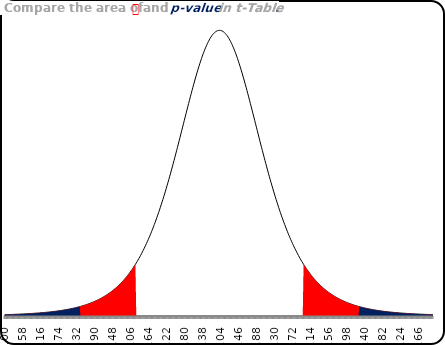
| Category | Series 0 | Series 1 | Series 2 | Series 3 | Series 4 |
|---|---|---|---|---|---|
| -5.0 | 0.002 | 0.002 | 0 | 0 | 0.002 |
| -4.98 | 0.002 | 0.002 | 0 | 0 | 0.002 |
| -4.960000000000001 | 0.002 | 0.002 | 0 | 0 | 0.002 |
| -4.940000000000001 | 0.002 | 0.002 | 0 | 0 | 0.002 |
| -4.920000000000002 | 0.002 | 0.002 | 0 | 0 | 0.002 |
| -4.900000000000002 | 0.002 | 0.002 | 0 | 0 | 0.002 |
| -4.880000000000003 | 0.002 | 0.002 | 0 | 0 | 0.002 |
| -4.860000000000003 | 0.002 | 0.002 | 0 | 0 | 0.002 |
| -4.840000000000003 | 0.002 | 0.002 | 0 | 0 | 0.002 |
| -4.820000000000004 | 0.002 | 0.002 | 0 | 0 | 0.002 |
| -4.800000000000004 | 0.002 | 0.002 | 0 | 0 | 0.002 |
| -4.780000000000005 | 0.002 | 0.002 | 0 | 0 | 0.002 |
| -4.760000000000005 | 0.002 | 0.002 | 0 | 0 | 0.002 |
| -4.7400000000000055 | 0.002 | 0.002 | 0 | 0 | 0.002 |
| -4.720000000000006 | 0.002 | 0.002 | 0 | 0 | 0.002 |
| -4.700000000000006 | 0.002 | 0.002 | 0 | 0 | 0.002 |
| -4.680000000000007 | 0.002 | 0.002 | 0 | 0 | 0.002 |
| -4.660000000000007 | 0.002 | 0.002 | 0 | 0 | 0.002 |
| -4.640000000000008 | 0.003 | 0.003 | 0 | 0 | 0.003 |
| -4.620000000000008 | 0.003 | 0.003 | 0 | 0 | 0.003 |
| -4.6000000000000085 | 0.003 | 0.003 | 0 | 0 | 0.003 |
| -4.580000000000009 | 0.003 | 0.003 | 0 | 0 | 0.003 |
| -4.560000000000009 | 0.003 | 0.003 | 0 | 0 | 0.003 |
| -4.54000000000001 | 0.003 | 0.003 | 0 | 0 | 0.003 |
| -4.52000000000001 | 0.003 | 0.003 | 0 | 0 | 0.003 |
| -4.500000000000011 | 0.003 | 0.003 | 0 | 0 | 0.003 |
| -4.480000000000011 | 0.003 | 0.003 | 0 | 0 | 0.003 |
| -4.4600000000000115 | 0.003 | 0.003 | 0 | 0 | 0.003 |
| -4.440000000000012 | 0.003 | 0.003 | 0 | 0 | 0.003 |
| -4.420000000000012 | 0.003 | 0.003 | 0 | 0 | 0.003 |
| -4.400000000000013 | 0.003 | 0.003 | 0 | 0 | 0.003 |
| -4.380000000000013 | 0.003 | 0.003 | 0 | 0 | 0.003 |
| -4.360000000000014 | 0.003 | 0.003 | 0 | 0 | 0.003 |
| -4.340000000000014 | 0.004 | 0.004 | 0 | 0 | 0.004 |
| -4.3200000000000145 | 0.004 | 0.004 | 0 | 0 | 0.004 |
| -4.300000000000015 | 0.004 | 0.004 | 0 | 0 | 0.004 |
| -4.280000000000015 | 0.004 | 0.004 | 0 | 0 | 0.004 |
| -4.260000000000016 | 0.004 | 0.004 | 0 | 0 | 0.004 |
| -4.240000000000016 | 0.004 | 0.004 | 0 | 0 | 0.004 |
| -4.220000000000017 | 0.004 | 0.004 | 0 | 0 | 0.004 |
| -4.200000000000017 | 0.004 | 0.004 | 0 | 0 | 0.004 |
| -4.1800000000000175 | 0.004 | 0.004 | 0 | 0 | 0.004 |
| -4.160000000000018 | 0.004 | 0.004 | 0 | 0 | 0.004 |
| -4.140000000000018 | 0.004 | 0.004 | 0 | 0 | 0.004 |
| -4.120000000000019 | 0.004 | 0.004 | 0 | 0 | 0.004 |
| -4.100000000000019 | 0.005 | 0.005 | 0 | 0 | 0.005 |
| -4.08000000000002 | 0.005 | 0.005 | 0 | 0 | 0.005 |
| -4.06000000000002 | 0.005 | 0.005 | 0 | 0 | 0.005 |
| -4.0400000000000205 | 0.005 | 0.005 | 0 | 0 | 0.005 |
| -4.020000000000021 | 0.005 | 0.005 | 0 | 0 | 0.005 |
| -4.000000000000021 | 0.005 | 0.005 | 0 | 0 | 0.005 |
| -3.9800000000000213 | 0.005 | 0.005 | 0 | 0 | 0.005 |
| -3.9600000000000213 | 0.005 | 0.005 | 0 | 0 | 0.005 |
| -3.9400000000000213 | 0.005 | 0.005 | 0 | 0 | 0.005 |
| -3.9200000000000212 | 0.006 | 0.006 | 0 | 0 | 0.006 |
| -3.9000000000000212 | 0.006 | 0.006 | 0 | 0 | 0.006 |
| -3.880000000000021 | 0.006 | 0.006 | 0 | 0 | 0.006 |
| -3.860000000000021 | 0.006 | 0.006 | 0 | 0 | 0.006 |
| -3.840000000000021 | 0.006 | 0.006 | 0 | 0 | 0.006 |
| -3.820000000000021 | 0.006 | 0.006 | 0 | 0 | 0.006 |
| -3.800000000000021 | 0.006 | 0.006 | 0 | 0 | 0.006 |
| -3.780000000000021 | 0.007 | 0.007 | 0 | 0 | 0.007 |
| -3.760000000000021 | 0.007 | 0.007 | 0 | 0 | 0.007 |
| -3.740000000000021 | 0.007 | 0.007 | 0 | 0 | 0.007 |
| -3.720000000000021 | 0.007 | 0.007 | 0 | 0 | 0.007 |
| -3.700000000000021 | 0.007 | 0.007 | 0 | 0 | 0.007 |
| -3.680000000000021 | 0.007 | 0.007 | 0 | 0 | 0.007 |
| -3.660000000000021 | 0.008 | 0.008 | 0 | 0 | 0.008 |
| -3.640000000000021 | 0.008 | 0.008 | 0 | 0 | 0.008 |
| -3.620000000000021 | 0.008 | 0.008 | 0 | 0 | 0.008 |
| -3.600000000000021 | 0.008 | 0.008 | 0 | 0 | 0.008 |
| -3.580000000000021 | 0.008 | 0.008 | 0 | 0 | 0.008 |
| -3.560000000000021 | 0.009 | 0.009 | 0 | 0 | 0.009 |
| -3.540000000000021 | 0.009 | 0.009 | 0 | 0 | 0.009 |
| -3.520000000000021 | 0.009 | 0.009 | 0 | 0 | 0.009 |
| -3.500000000000021 | 0.009 | 0.009 | 0 | 0 | 0.009 |
| -3.480000000000021 | 0.009 | 0.009 | 0 | 0 | 0.009 |
| -3.460000000000021 | 0.01 | 0.01 | 0 | 0 | 0.01 |
| -3.440000000000021 | 0.01 | 0.01 | 0 | 0 | 0.01 |
| -3.420000000000021 | 0.01 | 0.01 | 0 | 0 | 0.01 |
| -3.400000000000021 | 0.01 | 0.01 | 0 | 0 | 0.01 |
| -3.3800000000000208 | 0.011 | 0.011 | 0 | 0 | 0.011 |
| -3.3600000000000207 | 0.011 | 0.011 | 0 | 0 | 0.011 |
| -3.3400000000000207 | 0.011 | 0.011 | 0 | 0 | 0.011 |
| -3.3200000000000207 | 0.012 | 0.012 | 0 | 0 | 0.012 |
| -3.3000000000000207 | 0.012 | 0.012 | 0 | 0 | 0.012 |
| -3.2800000000000207 | 0.012 | 0.012 | 0 | 0 | 0.012 |
| -3.2600000000000207 | 0.012 | 0.012 | 0 | 0 | 0.012 |
| -3.2400000000000206 | 0.013 | 0.013 | 0 | 0 | 0 |
| -3.2200000000000206 | 0.013 | 0.013 | 0 | 0 | 0 |
| -3.2000000000000206 | 0.013 | 0.013 | 0 | 0 | 0 |
| -3.1800000000000206 | 0.014 | 0.014 | 0 | 0 | 0 |
| -3.1600000000000206 | 0.014 | 0.014 | 0 | 0 | 0 |
| -3.1400000000000206 | 0.014 | 0.014 | 0 | 0 | 0 |
| -3.1200000000000205 | 0.015 | 0.015 | 0 | 0 | 0 |
| -3.1000000000000205 | 0.015 | 0.015 | 0 | 0 | 0 |
| -3.0800000000000205 | 0.016 | 0.016 | 0 | 0 | 0 |
| -3.0600000000000205 | 0.016 | 0.016 | 0 | 0 | 0 |
| -3.0400000000000205 | 0.016 | 0.016 | 0 | 0 | 0 |
| -3.0200000000000204 | 0.017 | 0.017 | 0 | 0 | 0 |
| -3.0000000000000204 | 0.017 | 0.017 | 0 | 0 | 0 |
| -2.9800000000000204 | 0.018 | 0.018 | 0 | 0 | 0 |
| -2.9600000000000204 | 0.018 | 0.018 | 0 | 0 | 0 |
| -2.9400000000000204 | 0.019 | 0.019 | 0 | 0 | 0 |
| -2.9200000000000204 | 0.019 | 0.019 | 0 | 0 | 0 |
| -2.9000000000000203 | 0.02 | 0.02 | 0 | 0 | 0 |
| -2.8800000000000203 | 0.02 | 0.02 | 0 | 0 | 0 |
| -2.8600000000000203 | 0.021 | 0.021 | 0 | 0 | 0 |
| -2.8400000000000203 | 0.021 | 0.021 | 0 | 0 | 0 |
| -2.8200000000000203 | 0.022 | 0.022 | 0 | 0 | 0 |
| -2.8000000000000203 | 0.022 | 0.022 | 0 | 0 | 0 |
| -2.7800000000000202 | 0.023 | 0.023 | 0 | 0 | 0 |
| -2.76000000000002 | 0.024 | 0.024 | 0 | 0 | 0 |
| -2.74000000000002 | 0.024 | 0.024 | 0 | 0 | 0 |
| -2.72000000000002 | 0.025 | 0.025 | 0 | 0 | 0 |
| -2.70000000000002 | 0.026 | 0.026 | 0 | 0 | 0 |
| -2.68000000000002 | 0.026 | 0.026 | 0 | 0 | 0 |
| -2.66000000000002 | 0.027 | 0.027 | 0 | 0 | 0 |
| -2.64000000000002 | 0.028 | 0.028 | 0 | 0 | 0 |
| -2.62000000000002 | 0.028 | 0.028 | 0 | 0 | 0 |
| -2.60000000000002 | 0.029 | 0.029 | 0 | 0 | 0 |
| -2.58000000000002 | 0.03 | 0.03 | 0 | 0 | 0 |
| -2.56000000000002 | 0.031 | 0.031 | 0 | 0 | 0 |
| -2.54000000000002 | 0.032 | 0.032 | 0 | 0 | 0 |
| -2.52000000000002 | 0.032 | 0.032 | 0 | 0 | 0 |
| -2.50000000000002 | 0.033 | 0.033 | 0 | 0 | 0 |
| -2.48000000000002 | 0.034 | 0.034 | 0 | 0 | 0 |
| -2.46000000000002 | 0.035 | 0.035 | 0 | 0 | 0 |
| -2.44000000000002 | 0.036 | 0.036 | 0 | 0 | 0 |
| -2.42000000000002 | 0.037 | 0.037 | 0 | 0 | 0 |
| -2.40000000000002 | 0.038 | 0.038 | 0 | 0 | 0 |
| -2.38000000000002 | 0.039 | 0.039 | 0 | 0 | 0 |
| -2.36000000000002 | 0.04 | 0.04 | 0 | 0 | 0 |
| -2.34000000000002 | 0.041 | 0.041 | 0 | 0 | 0 |
| -2.32000000000002 | 0.042 | 0.042 | 0 | 0 | 0 |
| -2.30000000000002 | 0.044 | 0.044 | 0 | 0 | 0 |
| -2.28000000000002 | 0.045 | 0.045 | 0 | 0 | 0 |
| -2.2600000000000198 | 0.046 | 0.046 | 0 | 0 | 0 |
| -2.2400000000000198 | 0.047 | 0.047 | 0 | 0 | 0 |
| -2.2200000000000197 | 0.048 | 0.048 | 0 | 0 | 0 |
| -2.2000000000000197 | 0.05 | 0.05 | 0 | 0 | 0 |
| -2.1800000000000197 | 0.051 | 0.051 | 0 | 0 | 0 |
| -2.1600000000000197 | 0.053 | 0.053 | 0 | 0 | 0 |
| -2.1400000000000197 | 0.054 | 0.054 | 0 | 0 | 0 |
| -2.1200000000000196 | 0.055 | 0.055 | 0 | 0 | 0 |
| -2.1000000000000196 | 0.057 | 0.057 | 0 | 0 | 0 |
| -2.0800000000000196 | 0.058 | 0.058 | 0 | 0 | 0 |
| -2.0600000000000196 | 0.06 | 0.06 | 0 | 0 | 0 |
| -2.0400000000000196 | 0.062 | 0.062 | 0 | 0 | 0 |
| -2.0200000000000196 | 0.063 | 0.063 | 0 | 0 | 0 |
| -2.0000000000000195 | 0.065 | 0.065 | 0 | 0 | 0 |
| -1.9800000000000195 | 0.067 | 0.067 | 0 | 0 | 0 |
| -1.9600000000000195 | 0.069 | 0.069 | 0 | 0 | 0 |
| -1.9400000000000195 | 0.071 | 0 | 0 | 0 | 0 |
| -1.9200000000000195 | 0.072 | 0 | 0 | 0 | 0 |
| -1.9000000000000195 | 0.074 | 0 | 0 | 0 | 0 |
| -1.8800000000000194 | 0.076 | 0 | 0 | 0 | 0 |
| -1.8600000000000194 | 0.078 | 0 | 0 | 0 | 0 |
| -1.8400000000000194 | 0.08 | 0 | 0 | 0 | 0 |
| -1.8200000000000194 | 0.083 | 0 | 0 | 0 | 0 |
| -1.8000000000000194 | 0.085 | 0 | 0 | 0 | 0 |
| -1.7800000000000193 | 0.087 | 0 | 0 | 0 | 0 |
| -1.7600000000000193 | 0.089 | 0 | 0 | 0 | 0 |
| -1.7400000000000193 | 0.092 | 0 | 0 | 0 | 0 |
| -1.7200000000000193 | 0.094 | 0 | 0 | 0 | 0 |
| -1.7000000000000193 | 0.097 | 0 | 0 | 0 | 0 |
| -1.6800000000000193 | 0.099 | 0 | 0 | 0 | 0 |
| -1.6600000000000192 | 0.102 | 0 | 0 | 0 | 0 |
| -1.6400000000000192 | 0.104 | 0 | 0 | 0 | 0 |
| -1.6200000000000192 | 0.107 | 0 | 0 | 0 | 0 |
| -1.6000000000000192 | 0.11 | 0 | 0 | 0 | 0 |
| -1.5800000000000192 | 0.113 | 0 | 0 | 0 | 0 |
| -1.5600000000000191 | 0.116 | 0 | 0 | 0 | 0 |
| -1.5400000000000191 | 0.118 | 0 | 0 | 0 | 0 |
| -1.5200000000000191 | 0.121 | 0 | 0 | 0 | 0 |
| -1.500000000000019 | 0.125 | 0 | 0 | 0 | 0 |
| -1.480000000000019 | 0.128 | 0 | 0 | 0 | 0 |
| -1.460000000000019 | 0.131 | 0 | 0 | 0 | 0 |
| -1.440000000000019 | 0.134 | 0 | 0 | 0 | 0 |
| -1.420000000000019 | 0.137 | 0 | 0 | 0 | 0 |
| -1.400000000000019 | 0.141 | 0 | 0 | 0 | 0 |
| -1.380000000000019 | 0.144 | 0 | 0 | 0 | 0 |
| -1.360000000000019 | 0.148 | 0 | 0 | 0 | 0 |
| -1.340000000000019 | 0.151 | 0 | 0 | 0 | 0 |
| -1.320000000000019 | 0.155 | 0 | 0 | 0 | 0 |
| -1.300000000000019 | 0.158 | 0 | 0 | 0 | 0 |
| -1.280000000000019 | 0.162 | 0 | 0 | 0 | 0 |
| -1.2600000000000189 | 0.166 | 0 | 0 | 0 | 0 |
| -1.2400000000000189 | 0.17 | 0 | 0 | 0 | 0 |
| -1.2200000000000188 | 0.174 | 0 | 0 | 0 | 0 |
| -1.2000000000000188 | 0.178 | 0 | 0 | 0 | 0 |
| -1.1800000000000188 | 0.182 | 0 | 0 | 0 | 0 |
| -1.1600000000000188 | 0.186 | 0 | 0 | 0 | 0 |
| -1.1400000000000188 | 0.19 | 0 | 0 | 0 | 0 |
| -1.1200000000000188 | 0.194 | 0 | 0 | 0 | 0 |
| -1.1000000000000187 | 0.198 | 0 | 0 | 0 | 0 |
| -1.0800000000000187 | 0.202 | 0 | 0 | 0 | 0 |
| -1.0600000000000187 | 0.207 | 0 | 0 | 0 | 0 |
| -1.0400000000000187 | 0.211 | 0 | 0 | 0 | 0 |
| -1.0200000000000187 | 0.215 | 0 | 0 | 0 | 0 |
| -1.0000000000000187 | 0.22 | 0 | 0 | 0 | 0 |
| -0.9800000000000186 | 0.224 | 0 | 0 | 0 | 0 |
| -0.9600000000000186 | 0.229 | 0 | 0 | 0 | 0 |
| -0.9400000000000186 | 0.233 | 0 | 0 | 0 | 0 |
| -0.9200000000000186 | 0.237 | 0 | 0 | 0 | 0 |
| -0.9000000000000186 | 0.242 | 0 | 0 | 0 | 0 |
| -0.8800000000000185 | 0.246 | 0 | 0 | 0 | 0 |
| -0.8600000000000185 | 0.251 | 0 | 0 | 0 | 0 |
| -0.8400000000000185 | 0.255 | 0 | 0 | 0 | 0 |
| -0.8200000000000185 | 0.26 | 0 | 0 | 0 | 0 |
| -0.8000000000000185 | 0.264 | 0 | 0 | 0 | 0 |
| -0.7800000000000185 | 0.269 | 0 | 0 | 0 | 0 |
| -0.7600000000000184 | 0.273 | 0 | 0 | 0 | 0 |
| -0.7400000000000184 | 0.278 | 0 | 0 | 0 | 0 |
| -0.7200000000000184 | 0.282 | 0 | 0 | 0 | 0 |
| -0.7000000000000184 | 0.287 | 0 | 0 | 0 | 0 |
| -0.6800000000000184 | 0.291 | 0 | 0 | 0 | 0 |
| -0.6600000000000183 | 0.295 | 0 | 0 | 0 | 0 |
| -0.6400000000000183 | 0.3 | 0 | 0 | 0 | 0 |
| -0.6200000000000183 | 0.304 | 0 | 0 | 0 | 0 |
| -0.6000000000000183 | 0.308 | 0 | 0 | 0 | 0 |
| -0.5800000000000183 | 0.312 | 0 | 0 | 0 | 0 |
| -0.5600000000000183 | 0.316 | 0 | 0 | 0 | 0 |
| -0.5400000000000182 | 0.32 | 0 | 0 | 0 | 0 |
| -0.5200000000000182 | 0.324 | 0 | 0 | 0 | 0 |
| -0.5000000000000182 | 0.328 | 0 | 0 | 0 | 0 |
| -0.4800000000000182 | 0.332 | 0 | 0 | 0 | 0 |
| -0.46000000000001817 | 0.335 | 0 | 0 | 0 | 0 |
| -0.44000000000001815 | 0.339 | 0 | 0 | 0 | 0 |
| -0.42000000000001814 | 0.342 | 0 | 0 | 0 | 0 |
| -0.4000000000000181 | 0.345 | 0 | 0 | 0 | 0 |
| -0.3800000000000181 | 0.349 | 0 | 0 | 0 | 0 |
| -0.3600000000000181 | 0.352 | 0 | 0 | 0 | 0 |
| -0.34000000000001807 | 0.354 | 0 | 0 | 0 | 0 |
| -0.32000000000001805 | 0.357 | 0 | 0 | 0 | 0 |
| -0.30000000000001803 | 0.36 | 0 | 0 | 0 | 0 |
| -0.280000000000018 | 0.362 | 0 | 0 | 0 | 0 |
| -0.260000000000018 | 0.365 | 0 | 0 | 0 | 0 |
| -0.240000000000018 | 0.367 | 0 | 0 | 0 | 0 |
| -0.22000000000001801 | 0.369 | 0 | 0 | 0 | 0 |
| -0.20000000000001802 | 0.371 | 0 | 0 | 0 | 0 |
| -0.18000000000001803 | 0.372 | 0 | 0 | 0 | 0 |
| -0.16000000000001804 | 0.374 | 0 | 0 | 0 | 0 |
| -0.14000000000001805 | 0.375 | 0 | 0 | 0 | 0 |
| -0.12000000000001805 | 0.376 | 0 | 0 | 0 | 0 |
| -0.10000000000001805 | 0.377 | 0 | 0 | 0 | 0 |
| -0.08000000000001804 | 0.378 | 0 | 0 | 0 | 0 |
| -0.06000000000001804 | 0.379 | 0 | 0 | 0 | 0 |
| -0.040000000000018035 | 0.379 | 0 | 0 | 0 | 0 |
| -0.020000000000018035 | 0.38 | 0 | 0 | 0 | 0 |
| -1.8034185256254887e-14 | 0.38 | 0 | 0 | 0 | 0 |
| 0.019999999999981966 | 0.38 | 0 | 0 | 0 | 0 |
| 0.03999999999998197 | 0.379 | 0 | 0 | 0 | 0 |
| 0.05999999999998197 | 0.379 | 0 | 0 | 0 | 0 |
| 0.07999999999998197 | 0.378 | 0 | 0 | 0 | 0 |
| 0.09999999999998198 | 0.377 | 0 | 0 | 0 | 0 |
| 0.11999999999998198 | 0.376 | 0 | 0 | 0 | 0 |
| 0.13999999999998197 | 0.375 | 0 | 0 | 0 | 0 |
| 0.15999999999998196 | 0.374 | 0 | 0 | 0 | 0 |
| 0.17999999999998195 | 0.372 | 0 | 0 | 0 | 0 |
| 0.19999999999998194 | 0.371 | 0 | 0 | 0 | 0 |
| 0.21999999999998193 | 0.369 | 0 | 0 | 0 | 0 |
| 0.23999999999998192 | 0.367 | 0 | 0 | 0 | 0 |
| 0.2599999999999819 | 0.365 | 0 | 0 | 0 | 0 |
| 0.27999999999998193 | 0.362 | 0 | 0 | 0 | 0 |
| 0.29999999999998195 | 0.36 | 0 | 0 | 0 | 0 |
| 0.31999999999998197 | 0.357 | 0 | 0 | 0 | 0 |
| 0.339999999999982 | 0.354 | 0 | 0 | 0 | 0 |
| 0.359999999999982 | 0.352 | 0 | 0 | 0 | 0 |
| 0.379999999999982 | 0.349 | 0 | 0 | 0 | 0 |
| 0.39999999999998204 | 0.345 | 0 | 0 | 0 | 0 |
| 0.41999999999998205 | 0.342 | 0 | 0 | 0 | 0 |
| 0.43999999999998207 | 0.339 | 0 | 0 | 0 | 0 |
| 0.4599999999999821 | 0.335 | 0 | 0 | 0 | 0 |
| 0.4799999999999821 | 0.332 | 0 | 0 | 0 | 0 |
| 0.4999999999999821 | 0.328 | 0 | 0 | 0 | 0 |
| 0.5199999999999821 | 0.324 | 0 | 0 | 0 | 0 |
| 0.5399999999999822 | 0.32 | 0 | 0 | 0 | 0 |
| 0.5599999999999822 | 0.316 | 0 | 0 | 0 | 0 |
| 0.5799999999999822 | 0.312 | 0 | 0 | 0 | 0 |
| 0.5999999999999822 | 0.308 | 0 | 0 | 0 | 0 |
| 0.6199999999999822 | 0.304 | 0 | 0 | 0 | 0 |
| 0.6399999999999822 | 0.3 | 0 | 0 | 0 | 0 |
| 0.6599999999999823 | 0.295 | 0 | 0 | 0 | 0 |
| 0.6799999999999823 | 0.291 | 0 | 0 | 0 | 0 |
| 0.6999999999999823 | 0.287 | 0 | 0 | 0 | 0 |
| 0.7199999999999823 | 0.282 | 0 | 0 | 0 | 0 |
| 0.7399999999999823 | 0.278 | 0 | 0 | 0 | 0 |
| 0.7599999999999824 | 0.273 | 0 | 0 | 0 | 0 |
| 0.7799999999999824 | 0.269 | 0 | 0 | 0 | 0 |
| 0.7999999999999824 | 0.264 | 0 | 0 | 0 | 0 |
| 0.8199999999999824 | 0.26 | 0 | 0 | 0 | 0 |
| 0.8399999999999824 | 0.255 | 0 | 0 | 0 | 0 |
| 0.8599999999999824 | 0.251 | 0 | 0 | 0 | 0 |
| 0.8799999999999825 | 0.246 | 0 | 0 | 0 | 0 |
| 0.8999999999999825 | 0.242 | 0 | 0 | 0 | 0 |
| 0.9199999999999825 | 0.237 | 0 | 0 | 0 | 0 |
| 0.9399999999999825 | 0.233 | 0 | 0 | 0 | 0 |
| 0.9599999999999825 | 0.229 | 0 | 0 | 0 | 0 |
| 0.9799999999999826 | 0.224 | 0 | 0 | 0 | 0 |
| 0.9999999999999826 | 0.22 | 0 | 0 | 0 | 0 |
| 1.0199999999999825 | 0.215 | 0 | 0 | 0 | 0 |
| 1.0399999999999825 | 0.211 | 0 | 0 | 0 | 0 |
| 1.0599999999999825 | 0.207 | 0 | 0 | 0 | 0 |
| 1.0799999999999825 | 0.202 | 0 | 0 | 0 | 0 |
| 1.0999999999999825 | 0.198 | 0 | 0 | 0 | 0 |
| 1.1199999999999826 | 0.194 | 0 | 0 | 0 | 0 |
| 1.1399999999999826 | 0.19 | 0 | 0 | 0 | 0 |
| 1.1599999999999826 | 0.186 | 0 | 0 | 0 | 0 |
| 1.1799999999999826 | 0.182 | 0 | 0 | 0 | 0 |
| 1.1999999999999826 | 0.178 | 0 | 0 | 0 | 0 |
| 1.2199999999999827 | 0.174 | 0 | 0 | 0 | 0 |
| 1.2399999999999827 | 0.17 | 0 | 0 | 0 | 0 |
| 1.2599999999999827 | 0.166 | 0 | 0 | 0 | 0 |
| 1.2799999999999827 | 0.162 | 0 | 0 | 0 | 0 |
| 1.2999999999999827 | 0.158 | 0 | 0 | 0 | 0 |
| 1.3199999999999827 | 0.155 | 0 | 0 | 0 | 0 |
| 1.3399999999999828 | 0.151 | 0 | 0 | 0 | 0 |
| 1.3599999999999828 | 0.148 | 0 | 0 | 0 | 0 |
| 1.3799999999999828 | 0.144 | 0 | 0 | 0 | 0 |
| 1.3999999999999828 | 0.141 | 0 | 0 | 0 | 0 |
| 1.4199999999999828 | 0.137 | 0 | 0 | 0 | 0 |
| 1.4399999999999828 | 0.134 | 0 | 0 | 0 | 0 |
| 1.4599999999999829 | 0.131 | 0 | 0 | 0 | 0 |
| 1.4799999999999829 | 0.128 | 0 | 0 | 0 | 0 |
| 1.499999999999983 | 0.125 | 0 | 0 | 0 | 0 |
| 1.519999999999983 | 0.121 | 0 | 0 | 0 | 0 |
| 1.539999999999983 | 0.118 | 0 | 0 | 0 | 0 |
| 1.559999999999983 | 0.116 | 0 | 0 | 0 | 0 |
| 1.579999999999983 | 0.113 | 0 | 0 | 0 | 0 |
| 1.599999999999983 | 0.11 | 0 | 0 | 0 | 0 |
| 1.619999999999983 | 0.107 | 0 | 0 | 0 | 0 |
| 1.639999999999983 | 0.104 | 0 | 0 | 0 | 0 |
| 1.659999999999983 | 0.102 | 0 | 0 | 0 | 0 |
| 1.679999999999983 | 0.099 | 0 | 0 | 0 | 0 |
| 1.699999999999983 | 0.097 | 0 | 0 | 0 | 0 |
| 1.719999999999983 | 0.094 | 0 | 0 | 0 | 0 |
| 1.7399999999999831 | 0.092 | 0 | 0 | 0 | 0 |
| 1.7599999999999831 | 0.089 | 0 | 0 | 0 | 0 |
| 1.7799999999999832 | 0.087 | 0 | 0 | 0 | 0 |
| 1.7999999999999832 | 0.085 | 0 | 0 | 0 | 0 |
| 1.8199999999999832 | 0.083 | 0 | 0 | 0 | 0 |
| 1.8399999999999832 | 0.08 | 0 | 0 | 0 | 0 |
| 1.8599999999999832 | 0.078 | 0 | 0 | 0 | 0 |
| 1.8799999999999832 | 0.076 | 0 | 0 | 0 | 0 |
| 1.8999999999999833 | 0.074 | 0 | 0 | 0 | 0 |
| 1.9199999999999833 | 0.072 | 0 | 0 | 0 | 0 |
| 1.9399999999999833 | 0.071 | 0 | 0 | 0 | 0 |
| 1.9599999999999833 | 0.069 | 0 | 0.069 | 0 | 0 |
| 1.9799999999999833 | 0.067 | 0 | 0.067 | 0 | 0 |
| 1.9999999999999833 | 0.065 | 0 | 0.065 | 0 | 0 |
| 2.019999999999983 | 0.063 | 0 | 0.063 | 0 | 0 |
| 2.039999999999983 | 0.062 | 0 | 0.062 | 0 | 0 |
| 2.059999999999983 | 0.06 | 0 | 0.06 | 0 | 0 |
| 2.079999999999983 | 0.058 | 0 | 0.058 | 0 | 0 |
| 2.099999999999983 | 0.057 | 0 | 0.057 | 0 | 0 |
| 2.1199999999999832 | 0.055 | 0 | 0.055 | 0 | 0 |
| 2.1399999999999832 | 0.054 | 0 | 0.054 | 0 | 0 |
| 2.1599999999999833 | 0.053 | 0 | 0.053 | 0 | 0 |
| 2.1799999999999833 | 0.051 | 0 | 0.051 | 0 | 0 |
| 2.1999999999999833 | 0.05 | 0 | 0.05 | 0 | 0 |
| 2.2199999999999833 | 0.048 | 0 | 0.048 | 0 | 0 |
| 2.2399999999999833 | 0.047 | 0 | 0.047 | 0 | 0 |
| 2.2599999999999834 | 0.046 | 0 | 0.046 | 0 | 0 |
| 2.2799999999999834 | 0.045 | 0 | 0.045 | 0 | 0 |
| 2.2999999999999834 | 0.044 | 0 | 0.044 | 0 | 0 |
| 2.3199999999999834 | 0.042 | 0 | 0.042 | 0 | 0 |
| 2.3399999999999834 | 0.041 | 0 | 0.041 | 0 | 0 |
| 2.3599999999999834 | 0.04 | 0 | 0.04 | 0 | 0 |
| 2.3799999999999835 | 0.039 | 0 | 0.039 | 0 | 0 |
| 2.3999999999999835 | 0.038 | 0 | 0.038 | 0 | 0 |
| 2.4199999999999835 | 0.037 | 0 | 0.037 | 0 | 0 |
| 2.4399999999999835 | 0.036 | 0 | 0.036 | 0 | 0 |
| 2.4599999999999835 | 0.035 | 0 | 0.035 | 0 | 0 |
| 2.4799999999999836 | 0.034 | 0 | 0.034 | 0 | 0 |
| 2.4999999999999836 | 0.033 | 0 | 0.033 | 0 | 0 |
| 2.5199999999999836 | 0.032 | 0 | 0.032 | 0 | 0 |
| 2.5399999999999836 | 0.032 | 0 | 0.032 | 0 | 0 |
| 2.5599999999999836 | 0.031 | 0 | 0.031 | 0 | 0 |
| 2.5799999999999836 | 0.03 | 0 | 0.03 | 0 | 0 |
| 2.5999999999999837 | 0.029 | 0 | 0.029 | 0 | 0 |
| 2.6199999999999837 | 0.028 | 0 | 0.028 | 0 | 0 |
| 2.6399999999999837 | 0.028 | 0 | 0.028 | 0 | 0 |
| 2.6599999999999837 | 0.027 | 0 | 0.027 | 0 | 0 |
| 2.6799999999999837 | 0.026 | 0 | 0.026 | 0 | 0 |
| 2.6999999999999837 | 0.026 | 0 | 0.026 | 0 | 0 |
| 2.7199999999999838 | 0.025 | 0 | 0.025 | 0 | 0 |
| 2.739999999999984 | 0.024 | 0 | 0.024 | 0 | 0 |
| 2.759999999999984 | 0.024 | 0 | 0.024 | 0 | 0 |
| 2.779999999999984 | 0.023 | 0 | 0.023 | 0 | 0 |
| 2.799999999999984 | 0.022 | 0 | 0.022 | 0 | 0 |
| 2.819999999999984 | 0.022 | 0 | 0.022 | 0 | 0 |
| 2.839999999999984 | 0.021 | 0 | 0.021 | 0 | 0 |
| 2.859999999999984 | 0.021 | 0 | 0.021 | 0 | 0 |
| 2.879999999999984 | 0.02 | 0 | 0.02 | 0 | 0 |
| 2.899999999999984 | 0.02 | 0 | 0.02 | 0 | 0 |
| 2.919999999999984 | 0.019 | 0 | 0.019 | 0 | 0 |
| 2.939999999999984 | 0.019 | 0 | 0.019 | 0 | 0 |
| 2.959999999999984 | 0.018 | 0 | 0.018 | 0 | 0 |
| 2.979999999999984 | 0.018 | 0 | 0.018 | 0 | 0 |
| 2.999999999999984 | 0.017 | 0 | 0.017 | 0 | 0 |
| 3.019999999999984 | 0.017 | 0 | 0.017 | 0 | 0 |
| 3.039999999999984 | 0.016 | 0 | 0.016 | 0 | 0 |
| 3.059999999999984 | 0.016 | 0 | 0.016 | 0 | 0 |
| 3.079999999999984 | 0.016 | 0 | 0.016 | 0 | 0 |
| 3.099999999999984 | 0.015 | 0 | 0.015 | 0 | 0 |
| 3.119999999999984 | 0.015 | 0 | 0.015 | 0 | 0 |
| 3.139999999999984 | 0.014 | 0 | 0.014 | 0 | 0 |
| 3.159999999999984 | 0.014 | 0 | 0.014 | 0 | 0 |
| 3.179999999999984 | 0.014 | 0 | 0.014 | 0 | 0 |
| 3.199999999999984 | 0.013 | 0 | 0.013 | 0 | 0 |
| 3.219999999999984 | 0.013 | 0 | 0.013 | 0 | 0 |
| 3.2399999999999842 | 0.013 | 0 | 0.013 | 0 | 0 |
| 3.2599999999999842 | 0.012 | 0 | 0.012 | 0.012 | 0 |
| 3.2799999999999843 | 0.012 | 0 | 0.012 | 0.012 | 0 |
| 3.2999999999999843 | 0.012 | 0 | 0.012 | 0.012 | 0 |
| 3.3199999999999843 | 0.012 | 0 | 0.012 | 0.012 | 0 |
| 3.3399999999999843 | 0.011 | 0 | 0.011 | 0.011 | 0 |
| 3.3599999999999843 | 0.011 | 0 | 0.011 | 0.011 | 0 |
| 3.3799999999999844 | 0.011 | 0 | 0.011 | 0.011 | 0 |
| 3.3999999999999844 | 0.01 | 0 | 0.01 | 0.01 | 0 |
| 3.4199999999999844 | 0.01 | 0 | 0.01 | 0.01 | 0 |
| 3.4399999999999844 | 0.01 | 0 | 0.01 | 0.01 | 0 |
| 3.4599999999999844 | 0.01 | 0 | 0.01 | 0.01 | 0 |
| 3.4799999999999844 | 0.009 | 0 | 0.009 | 0.009 | 0 |
| 3.4999999999999845 | 0.009 | 0 | 0.009 | 0.009 | 0 |
| 3.5199999999999845 | 0.009 | 0 | 0.009 | 0.009 | 0 |
| 3.5399999999999845 | 0.009 | 0 | 0.009 | 0.009 | 0 |
| 3.5599999999999845 | 0.009 | 0 | 0.009 | 0.009 | 0 |
| 3.5799999999999845 | 0.008 | 0 | 0.008 | 0.008 | 0 |
| 3.5999999999999845 | 0.008 | 0 | 0.008 | 0.008 | 0 |
| 3.6199999999999846 | 0.008 | 0 | 0.008 | 0.008 | 0 |
| 3.6399999999999846 | 0.008 | 0 | 0.008 | 0.008 | 0 |
| 3.6599999999999846 | 0.008 | 0 | 0.008 | 0.008 | 0 |
| 3.6799999999999846 | 0.007 | 0 | 0.007 | 0.007 | 0 |
| 3.6999999999999846 | 0.007 | 0 | 0.007 | 0.007 | 0 |
| 3.7199999999999847 | 0.007 | 0 | 0.007 | 0.007 | 0 |
| 3.7399999999999847 | 0.007 | 0 | 0.007 | 0.007 | 0 |
| 3.7599999999999847 | 0.007 | 0 | 0.007 | 0.007 | 0 |
| 3.7799999999999847 | 0.007 | 0 | 0.007 | 0.007 | 0 |
| 3.7999999999999847 | 0.006 | 0 | 0.006 | 0.006 | 0 |
| 3.8199999999999847 | 0.006 | 0 | 0.006 | 0.006 | 0 |
| 3.8399999999999848 | 0.006 | 0 | 0.006 | 0.006 | 0 |
| 3.8599999999999848 | 0.006 | 0 | 0.006 | 0.006 | 0 |
| 3.879999999999985 | 0.006 | 0 | 0.006 | 0.006 | 0 |
| 3.899999999999985 | 0.006 | 0 | 0.006 | 0.006 | 0 |
| 3.919999999999985 | 0.006 | 0 | 0.006 | 0.006 | 0 |
| 3.939999999999985 | 0.005 | 0 | 0.005 | 0.005 | 0 |
| 3.959999999999985 | 0.005 | 0 | 0.005 | 0.005 | 0 |
| 3.979999999999985 | 0.005 | 0 | 0.005 | 0.005 | 0 |
| 3.999999999999985 | 0.005 | 0 | 0.005 | 0.005 | 0 |
| 4.0199999999999845 | 0.005 | 0 | 0.005 | 0.005 | 0 |
| 4.039999999999984 | 0.005 | 0 | 0.005 | 0.005 | 0 |
| 4.059999999999984 | 0.005 | 0 | 0.005 | 0.005 | 0 |
| 4.079999999999983 | 0.005 | 0 | 0.005 | 0.005 | 0 |
| 4.099999999999983 | 0.005 | 0 | 0.005 | 0.005 | 0 |
| 4.119999999999982 | 0.004 | 0 | 0.004 | 0.004 | 0 |
| 4.139999999999982 | 0.004 | 0 | 0.004 | 0.004 | 0 |
| 4.1599999999999815 | 0.004 | 0 | 0.004 | 0.004 | 0 |
| 4.179999999999981 | 0.004 | 0 | 0.004 | 0.004 | 0 |
| 4.199999999999981 | 0.004 | 0 | 0.004 | 0.004 | 0 |
| 4.21999999999998 | 0.004 | 0 | 0.004 | 0.004 | 0 |
| 4.23999999999998 | 0.004 | 0 | 0.004 | 0.004 | 0 |
| 4.259999999999979 | 0.004 | 0 | 0.004 | 0.004 | 0 |
| 4.279999999999979 | 0.004 | 0 | 0.004 | 0.004 | 0 |
| 4.2999999999999785 | 0.004 | 0 | 0.004 | 0.004 | 0 |
| 4.319999999999978 | 0.004 | 0 | 0.004 | 0.004 | 0 |
| 4.339999999999978 | 0.004 | 0 | 0.004 | 0.004 | 0 |
| 4.359999999999977 | 0.003 | 0 | 0.003 | 0.003 | 0 |
| 4.379999999999977 | 0.003 | 0 | 0.003 | 0.003 | 0 |
| 4.399999999999976 | 0.003 | 0 | 0.003 | 0.003 | 0 |
| 4.419999999999976 | 0.003 | 0 | 0.003 | 0.003 | 0 |
| 4.4399999999999755 | 0.003 | 0 | 0.003 | 0.003 | 0 |
| 4.459999999999975 | 0.003 | 0 | 0.003 | 0.003 | 0 |
| 4.479999999999975 | 0.003 | 0 | 0.003 | 0.003 | 0 |
| 4.499999999999974 | 0.003 | 0 | 0.003 | 0.003 | 0 |
| 4.519999999999974 | 0.003 | 0 | 0.003 | 0.003 | 0 |
| 4.539999999999973 | 0.003 | 0 | 0.003 | 0.003 | 0 |
| 4.559999999999973 | 0.003 | 0 | 0.003 | 0.003 | 0 |
| 4.5799999999999725 | 0.003 | 0 | 0.003 | 0.003 | 0 |
| 4.599999999999972 | 0.003 | 0 | 0.003 | 0.003 | 0 |
| 4.619999999999972 | 0.003 | 0 | 0.003 | 0.003 | 0 |
| 4.639999999999971 | 0.003 | 0 | 0.003 | 0.003 | 0 |
| 4.659999999999971 | 0.002 | 0 | 0.002 | 0.002 | 0 |
| 4.67999999999997 | 0.002 | 0 | 0.002 | 0.002 | 0 |
| 4.69999999999997 | 0.002 | 0 | 0.002 | 0.002 | 0 |
| 4.7199999999999696 | 0.002 | 0 | 0.002 | 0.002 | 0 |
| 4.739999999999969 | 0.002 | 0 | 0.002 | 0.002 | 0 |
| 4.759999999999969 | 0.002 | 0 | 0.002 | 0.002 | 0 |
| 4.779999999999968 | 0.002 | 0 | 0.002 | 0.002 | 0 |
| 4.799999999999968 | 0.002 | 0 | 0.002 | 0.002 | 0 |
| 4.819999999999967 | 0.002 | 0 | 0.002 | 0.002 | 0 |
| 4.839999999999967 | 0.002 | 0 | 0.002 | 0.002 | 0 |
| 4.859999999999967 | 0.002 | 0 | 0.002 | 0.002 | 0 |
| 4.879999999999966 | 0.002 | 0 | 0.002 | 0.002 | 0 |
| 4.899999999999966 | 0.002 | 0 | 0.002 | 0.002 | 0 |
| 4.919999999999965 | 0.002 | 0 | 0.002 | 0.002 | 0 |
| 4.939999999999965 | 0.002 | 0 | 0.002 | 0.002 | 0 |
| 4.959999999999964 | 0.002 | 0 | 0.002 | 0.002 | 0 |
| 4.979999999999964 | 0.002 | 0 | 0.002 | 0.002 | 0 |
| 4.999999999999964 | 0.002 | 0 | 0.002 | 0.002 | 0 |